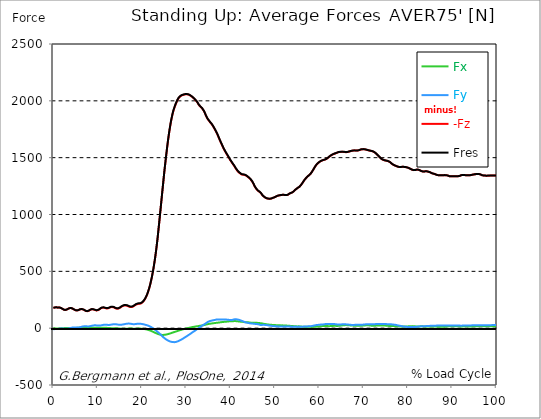
| Category |  Fx |  Fy |  -Fz |  Fres |
|---|---|---|---|---|
| 0.0 | -1.342 | -9.124 | 178.404 | 178.734 |
| 0.167348456675344 | -1.436 | -8.606 | 179.699 | 179.982 |
| 0.334696913350688 | -1.813 | -8.171 | 182.03 | 182.289 |
| 0.5020453700260321 | -2.155 | -7.617 | 183.82 | 184.043 |
| 0.669393826701376 | -2.355 | -6.723 | 183.914 | 184.102 |
| 0.83674228337672 | -2.096 | -6.687 | 181.901 | 182.089 |
| 1.0040907400520642 | -1.943 | -6.711 | 180.523 | 180.7 |
| 1.1621420602454444 | -2.296 | -5.969 | 181.889 | 182.054 |
| 1.3294905169207885 | -2.508 | -5.145 | 182.289 | 182.43 |
| 1.4968389735961325 | -2.484 | -4.286 | 181.041 | 181.171 |
| 1.6641874302714765 | -2.261 | -3.626 | 178.639 | 178.745 |
| 1.8315358869468206 | -1.848 | -3.273 | 175.566 | 175.661 |
| 1.9988843436221646 | -1.26 | -2.79 | 171.257 | 171.34 |
| 2.1662328002975086 | -0.506 | -3.002 | 166.854 | 166.937 |
| 2.333581256972853 | 0.224 | -3.626 | 163.216 | 163.31 |
| 2.5009297136481967 | 0.789 | -4.568 | 160.85 | 160.979 |
| 2.6682781703235405 | 1.107 | -5.133 | 160.284 | 160.438 |
| 2.8356266269988843 | 1.377 | -5.545 | 161.273 | 161.438 |
| 3.002975083674229 | 1.436 | -5.345 | 163.357 | 163.534 |
| 3.1703235403495724 | 1.377 | -4.768 | 166.736 | 166.901 |
| 3.337671997024917 | 0.977 | -3.473 | 170.798 | 170.928 |
| 3.4957233172182973 | 0.542 | -2.06 | 174.319 | 174.413 |
| 3.663071773893641 | 0.271 | -0.224 | 176.132 | 176.226 |
| 3.8304202305689854 | 0.071 | 1.648 | 177.274 | 177.368 |
| 3.997768687244329 | 0.047 | 3.273 | 176.673 | 176.803 |
| 4.165117143919673 | 0.141 | 4.486 | 174.99 | 175.143 |
| 4.332465600595017 | 0.318 | 5.734 | 172.364 | 172.564 |
| 4.499814057270361 | 0.612 | 6.452 | 168.832 | 169.079 |
| 4.667162513945706 | 1.118 | 6.84 | 164.358 | 164.664 |
| 4.834510970621049 | 1.625 | 6.982 | 160.485 | 160.826 |
| 5.001859427296393 | 2.096 | 6.523 | 157.718 | 158.059 |
| 5.169207883971737 | 2.531 | 5.946 | 155.834 | 156.176 |
| 5.336556340647081 | 2.802 | 5.486 | 155.999 | 156.352 |
| 5.503904797322425 | 2.908 | 5.263 | 157.023 | 157.388 |
| 5.671253253997769 | 2.955 | 5.522 | 159.131 | 159.519 |
| 5.82930457419115 | 2.767 | 6.628 | 162.286 | 162.722 |
| 5.996653030866494 | 2.543 | 8.43 | 165.477 | 166.054 |
| 6.164001487541838 | 2.319 | 10.243 | 167.09 | 167.784 |
| 6.331349944217181 | 2.143 | 11.927 | 167.843 | 168.62 |
| 6.498698400892526 | 2.178 | 13.528 | 166.748 | 167.643 |
| 6.66604685756787 | 2.308 | 15.023 | 165.088 | 166.112 |
| 6.833395314243213 | 2.567 | 15.977 | 162.427 | 163.558 |
| 7.000743770918558 | 2.99 | 16.789 | 158.813 | 160.014 |
| 7.168092227593902 | 3.497 | 16.707 | 154.704 | 155.917 |
| 7.335440684269246 | 3.991 | 16.53 | 150.807 | 152.043 |
| 7.50278914094459 | 4.25 | 16.13 | 149.559 | 150.771 |
| 7.6701375976199335 | 4.368 | 15.612 | 149.406 | 150.583 |
| 7.837486054295278 | 4.45 | 15.788 | 150.654 | 151.796 |
| 7.995537374488658 | 4.439 | 15.741 | 153.468 | 154.598 |
| 8.162885831164003 | 4.274 | 16.306 | 157.435 | 158.613 |
| 8.330234287839346 | 4.015 | 17.625 | 161.78 | 163.075 |
| 8.49758274451469 | 3.815 | 19.167 | 165.206 | 166.666 |
| 8.664931201190035 | 3.838 | 20.816 | 166.159 | 167.831 |
| 8.832279657865378 | 3.873 | 22.417 | 165.983 | 167.867 |
| 8.999628114540721 | 3.991 | 23.771 | 165.006 | 167.101 |
| 9.166976571216066 | 4.132 | 24.713 | 163.11 | 165.371 |
| 9.334325027891412 | 4.356 | 25.207 | 160.39 | 162.745 |
| 9.501673484566755 | 4.533 | 24.995 | 157.459 | 159.825 |
| 9.669021941242098 | 4.615 | 24.571 | 156.128 | 158.448 |
| 9.836370397917442 | 4.674 | 23.877 | 155.657 | 157.894 |
| 10.003718854592787 | 4.615 | 23.488 | 156.882 | 159.06 |
| 10.17106731126813 | 4.403 | 23.17 | 159.649 | 161.756 |
| 10.329118631461512 | 4.168 | 23.241 | 163.593 | 165.724 |
| 10.496467088136853 | 3.885 | 23.453 | 168.703 | 170.822 |
| 10.663815544812199 | 3.532 | 23.936 | 174.13 | 176.308 |
| 10.831164001487544 | 3.261 | 25.101 | 177.827 | 180.111 |
| 10.998512458162887 | 3.061 | 26.549 | 180.005 | 182.466 |
| 11.16586091483823 | 3.014 | 28.092 | 180.817 | 183.502 |
| 11.333209371513574 | 3.026 | 29.375 | 180.511 | 183.384 |
| 11.50055782818892 | 3.049 | 30.281 | 179.334 | 182.383 |
| 11.667906284864264 | 3.096 | 30.611 | 177.015 | 180.17 |
| 11.835254741539607 | 3.026 | 30.446 | 174.742 | 177.909 |
| 12.00260319821495 | 2.837 | 29.975 | 173.212 | 176.32 |
| 12.169951654890292 | 2.508 | 29.139 | 173.306 | 176.226 |
| 12.337300111565641 | 2.084 | 28.61 | 174.472 | 177.25 |
| 12.504648568240984 | 1.566 | 28.48 | 176.767 | 179.452 |
| 12.662699888434362 | 1.013 | 28.716 | 180.146 | 182.795 |
| 12.830048345109708 | 0.459 | 29.657 | 182.89 | 185.656 |
| 12.997396801785053 | -0.071 | 30.752 | 185.115 | 188.035 |
| 13.164745258460396 | -0.447 | 31.989 | 186.163 | 189.306 |
| 13.33209371513574 | -0.624 | 33.131 | 185.774 | 189.141 |
| 13.499442171811083 | -0.754 | 34.073 | 184.479 | 188.07 |
| 13.666790628486426 | -0.918 | 34.708 | 182.266 | 186.033 |
| 13.834139085161771 | -0.848 | 35.05 | 178.934 | 182.807 |
| 14.001487541837117 | -0.648 | 34.791 | 174.954 | 178.828 |
| 14.16883599851246 | -0.836 | 33.837 | 172.341 | 176.096 |
| 14.336184455187803 | -1.354 | 33.036 | 170.881 | 174.554 |
| 14.503532911863147 | -1.978 | 31.953 | 171.34 | 174.872 |
| 14.670881368538492 | -2.602 | 30.894 | 172.682 | 176.061 |
| 14.828932688731873 | -3.191 | 30.105 | 175.402 | 178.651 |
| 14.996281145407215 | -3.685 | 29.622 | 178.957 | 182.113 |
| 15.163629602082558 | -3.991 | 29.775 | 183.337 | 186.504 |
| 15.330978058757903 | -4.486 | 30.411 | 188.07 | 191.308 |
| 15.498326515433247 | -4.839 | 31.329 | 191.943 | 195.264 |
| 15.665674972108594 | -5.086 | 32.401 | 195.287 | 198.725 |
| 15.833023428783937 | -5.133 | 33.802 | 198.101 | 201.751 |
| 16.00037188545928 | -5.192 | 35.12 | 199.714 | 203.529 |
| 16.167720342134626 | -5.098 | 36.533 | 200.161 | 204.235 |
| 16.335068798809967 | -4.933 | 37.734 | 199.855 | 204.141 |
| 16.502417255485312 | -4.639 | 38.841 | 198.631 | 203.14 |
| 16.669765712160658 | -4.333 | 39.771 | 196.464 | 201.197 |
| 16.837114168836 | -4.015 | 40.207 | 193.568 | 198.442 |
| 17.004462625511344 | -3.65 | 40.36 | 190.272 | 195.205 |
| 17.16251394570472 | -3.332 | 40.112 | 187.093 | 192.026 |
| 17.32986240238007 | -3.238 | 39.618 | 185.586 | 190.519 |
| 17.497210859055414 | -3.32 | 38.44 | 184.832 | 189.601 |
| 17.664559315730756 | -3.579 | 37.192 | 185.609 | 190.166 |
| 17.8319077724061 | -3.921 | 35.968 | 187.352 | 191.637 |
| 17.999256229081443 | -4.238 | 34.967 | 190.578 | 194.675 |
| 18.166604685756788 | -4.486 | 34.697 | 194.404 | 198.36 |
| 18.333953142432133 | -4.474 | 35.438 | 199.584 | 203.576 |
| 18.501301599107478 | -4.333 | 36.498 | 204.447 | 208.532 |
| 18.668650055782823 | -4.132 | 37.463 | 207.59 | 211.817 |
| 18.835998512458165 | -4.097 | 37.805 | 210.581 | 214.902 |
| 19.00334696913351 | -4.027 | 38.299 | 212.783 | 217.221 |
| 19.170695425808855 | -3.779 | 39.006 | 213.96 | 218.516 |
| 19.338043882484197 | -3.614 | 38.947 | 214.596 | 219.117 |
| 19.496095202677576 | -3.461 | 38.805 | 215.196 | 219.658 |
| 19.66344365935292 | -3.873 | 38.723 | 216.114 | 220.53 |
| 19.830792116028263 | -4.403 | 38.028 | 219.07 | 223.308 |
| 19.998140572703612 | -4.992 | 36.71 | 223.496 | 227.476 |
| 20.165489029378953 | -5.722 | 35.273 | 229.289 | 232.951 |
| 20.3328374860543 | -6.428 | 33.931 | 236.836 | 240.168 |
| 20.500185942729644 | -7.382 | 32.471 | 246.031 | 249.139 |
| 20.667534399404985 | -8.489 | 30.882 | 255.921 | 258.817 |
| 20.83488285608033 | -9.642 | 29.057 | 267.706 | 270.379 |
| 21.002231312755672 | -11.02 | 27.079 | 281.493 | 283.918 |
| 21.16957976943102 | -12.645 | 24.995 | 297.399 | 299.612 |
| 21.336928226106362 | -14.47 | 22.805 | 315.459 | 317.52 |
| 21.504276682781704 | -16.33 | 20.415 | 335.521 | 337.452 |
| 21.67162513945705 | -18.331 | 17.672 | 357.279 | 359.151 |
| 21.82967645965043 | -20.827 | 14.423 | 382.05 | 383.852 |
| 21.997024916325774 | -23.523 | 10.902 | 409.377 | 411.072 |
| 22.16437337300112 | -26.29 | 7.194 | 438.728 | 440.376 |
| 22.33172182967646 | -29.234 | 3.144 | 471.317 | 472.989 |
| 22.499070286351806 | -32.259 | -1.083 | 506.096 | 507.815 |
| 22.666418743027148 | -35.285 | -5.675 | 544.348 | 546.149 |
| 22.833767199702496 | -38.323 | -10.573 | 585.532 | 587.474 |
| 23.00111565637784 | -41.278 | -15.706 | 630.377 | 632.496 |
| 23.168464113053183 | -44.151 | -20.922 | 678.542 | 680.826 |
| 23.335812569728528 | -47 | -26.243 | 730.711 | 733.195 |
| 23.50316102640387 | -49.802 | -31.753 | 785.893 | 788.566 |
| 23.670509483079215 | -52.345 | -37.404 | 848.116 | 850.989 |
| 23.83785793975456 | -54.476 | -42.761 | 910.374 | 913.424 |
| 23.995909259947936 | -56.454 | -48.742 | 974.705 | 977.978 |
| 24.163257716623285 | -57.89 | -54.806 | 1038.717 | 1042.202 |
| 24.330606173298627 | -58.667 | -61.352 | 1104.943 | 1108.617 |
| 24.49795462997397 | -59.232 | -67.957 | 1168.673 | 1172.547 |
| 24.665303086649313 | -59.35 | -74.585 | 1232.568 | 1236.63 |
| 24.83265154332466 | -59.232 | -80.295 | 1297.617 | 1301.808 |
| 25.0 | -58.856 | -86.123 | 1361.476 | 1365.809 |
| 25.167348456675345 | -58.043 | -91.292 | 1420.897 | 1425.347 |
| 25.334696913350694 | -56.984 | -96.095 | 1477.386 | 1481.919 |
| 25.502045370026035 | -55.406 | -100.593 | 1533.57 | 1538.173 |
| 25.669393826701377 | -53.887 | -104.69 | 1587.904 | 1592.555 |
| 25.836742283376722 | -52.333 | -108.481 | 1639.508 | 1644.205 |
| 26.004090740052067 | -50.638 | -111.778 | 1687.131 | 1691.864 |
| 26.17143919672741 | -48.672 | -114.603 | 1731.129 | 1735.874 |
| 26.329490516920792 | -46.505 | -117.087 | 1772.195 | 1776.951 |
| 26.49683897359613 | -44.304 | -119.16 | 1810.117 | 1814.874 |
| 26.66418743027148 | -42.079 | -120.514 | 1842.836 | 1847.557 |
| 26.831535886946828 | -39.842 | -121.679 | 1873.035 | 1877.733 |
| 26.998884343622166 | -37.616 | -122.762 | 1900.656 | 1905.318 |
| 27.166232800297514 | -35.497 | -123.233 | 1922.743 | 1927.346 |
| 27.333581256972852 | -33.425 | -122.88 | 1942.216 | 1946.737 |
| 27.5009297136482 | -31.365 | -122.409 | 1960.288 | 1964.727 |
| 27.668278170323543 | -29.304 | -121.055 | 1976.665 | 1980.951 |
| 27.835626626998888 | -27.373 | -119.289 | 1992.513 | 1996.633 |
| 28.002975083674233 | -25.03 | -116.734 | 2006.535 | 2010.467 |
| 28.170323540349575 | -22.794 | -114.026 | 2018.391 | 2022.146 |
| 28.33767199702492 | -20.662 | -111.26 | 2027.739 | 2031.342 |
| 28.50502045370026 | -18.579 | -108.316 | 2035.05 | 2038.5 |
| 28.663071773893645 | -16.471 | -104.655 | 2040.866 | 2044.175 |
| 28.830420230568986 | -14.505 | -101.193 | 2044.905 | 2048.036 |
| 28.99776868724433 | -12.633 | -97.461 | 2048.46 | 2051.462 |
| 29.165117143919673 | -10.914 | -93.847 | 2050.709 | 2053.582 |
| 29.33246560059502 | -9.089 | -89.867 | 2052.722 | 2055.477 |
| 29.499814057270367 | -7.37 | -85.605 | 2054.665 | 2057.361 |
| 29.66716251394571 | -5.757 | -81.261 | 2056.195 | 2058.868 |
| 29.834510970621054 | -4.109 | -77.234 | 2057.267 | 2059.892 |
| 30.00185942729639 | -2.272 | -73.031 | 2057.502 | 2060.01 |
| 30.169207883971744 | -0.624 | -68.84 | 2057.385 | 2059.81 |
| 30.33655634064708 | 0.824 | -64.625 | 2056.396 | 2058.786 |
| 30.50390479732243 | 2.049 | -60.751 | 2054.7 | 2057.067 |
| 30.671253253997772 | 3.509 | -56.148 | 2052.075 | 2054.335 |
| 30.829304574191156 | 4.745 | -51.851 | 2048.966 | 2051.145 |
| 30.996653030866494 | 6.428 | -47.365 | 2043.916 | 2046.011 |
| 31.164001487541842 | 7.818 | -42.432 | 2039.171 | 2041.184 |
| 31.331349944217187 | 9.23 | -37.887 | 2034.132 | 2036.157 |
| 31.498698400892525 | 10.549 | -33.272 | 2028.622 | 2030.67 |
| 31.666046857567874 | 11.703 | -29.069 | 2022.664 | 2024.76 |
| 31.833395314243212 | 12.692 | -25.419 | 2016.413 | 2018.567 |
| 32.00074377091856 | 13.94 | -21.039 | 2008.772 | 2010.856 |
| 32.1680922275939 | 15.141 | -15.753 | 2001.755 | 2003.815 |
| 32.33544068426925 | 16.365 | -10.949 | 1995.209 | 1997.304 |
| 32.50278914094459 | 17.307 | -7.205 | 1985.331 | 1987.415 |
| 32.670137597619934 | 18.131 | -2.661 | 1973.604 | 1975.665 |
| 32.83748605429528 | 19.426 | 2.39 | 1963.95 | 1965.987 |
| 33.004834510970625 | 20.768 | 7.453 | 1955.932 | 1957.969 |
| 33.162885831164004 | 21.899 | 12.009 | 1948.962 | 1951.117 |
| 33.33023428783935 | 22.852 | 16.365 | 1943.335 | 1945.654 |
| 33.497582744514695 | 23.865 | 20.651 | 1936.506 | 1938.931 |
| 33.664931201190036 | 24.948 | 24.748 | 1927.17 | 1929.677 |
| 33.83227965786538 | 26.008 | 28.751 | 1917.48 | 1920.094 |
| 33.99962811454073 | 27.091 | 32.589 | 1907.19 | 1909.91 |
| 34.16697657121607 | 28.798 | 36.71 | 1893.026 | 1895.675 |
| 34.33432502789141 | 30.599 | 41.101 | 1877.686 | 1880.217 |
| 34.50167348456676 | 32.46 | 45.622 | 1863.133 | 1865.535 |
| 34.6690219412421 | 34.19 | 50.379 | 1849.559 | 1851.866 |
| 34.83637039791744 | 35.591 | 54.782 | 1838.727 | 1841.035 |
| 35.00371885459279 | 36.521 | 57.502 | 1830.544 | 1832.982 |
| 35.17106731126814 | 37.581 | 59.597 | 1822.197 | 1824.775 |
| 35.338415767943474 | 39.123 | 62.67 | 1812.637 | 1815.274 |
| 35.49646708813686 | 40.324 | 64.378 | 1805.031 | 1807.739 |
| 35.6638155448122 | 41.207 | 65.743 | 1797.743 | 1800.487 |
| 35.831164001487544 | 41.984 | 67.568 | 1788.077 | 1790.868 |
| 35.998512458162885 | 42.773 | 69.405 | 1778.4 | 1781.249 |
| 36.165860914838234 | 43.656 | 70.37 | 1767.25 | 1770.193 |
| 36.333209371513576 | 44.586 | 71.512 | 1755.665 | 1758.679 |
| 36.50055782818892 | 45.528 | 73.29 | 1743.55 | 1746.623 |
| 36.667906284864266 | 46.458 | 74.597 | 1731.176 | 1734.308 |
| 36.83525474153961 | 47.388 | 75.939 | 1718.402 | 1721.604 |
| 37.002603198214956 | 48.154 | 77.116 | 1704.956 | 1708.241 |
| 37.1699516548903 | 48.719 | 77.211 | 1689.733 | 1693.077 |
| 37.337300111565646 | 49.366 | 77.234 | 1673.921 | 1677.312 |
| 37.50464856824098 | 50.238 | 77.105 | 1658.51 | 1661.96 |
| 37.66269988843437 | 51.356 | 76.822 | 1643.511 | 1647.007 |
| 37.83004834510971 | 52.404 | 76.528 | 1628.817 | 1632.385 |
| 37.99739680178505 | 53.275 | 76.151 | 1614.913 | 1618.539 |
| 38.16474525846039 | 54.335 | 75.739 | 1600.078 | 1603.775 |
| 38.33209371513574 | 54.9 | 75.374 | 1586.209 | 1589.906 |
| 38.49944217181109 | 55.477 | 75.433 | 1572.928 | 1576.649 |
| 38.666790628486424 | 56.065 | 75.692 | 1560.778 | 1564.499 |
| 38.83413908516178 | 56.583 | 75.916 | 1549.37 | 1553.125 |
| 39.001487541837115 | 57.172 | 75.645 | 1538.42 | 1542.2 |
| 39.16883599851246 | 57.867 | 74.75 | 1527.565 | 1531.356 |
| 39.336184455187805 | 58.314 | 73.561 | 1516.804 | 1520.607 |
| 39.503532911863154 | 59.268 | 72.984 | 1505.725 | 1509.587 |
| 39.670881368538495 | 60.021 | 72.843 | 1494.423 | 1498.331 |
| 39.83822982521384 | 60.375 | 72.843 | 1483.238 | 1487.147 |
| 39.996281145407224 | 60.586 | 72.819 | 1472.771 | 1476.668 |
| 40.163629602082565 | 60.598 | 72.513 | 1463.034 | 1466.908 |
| 40.33097805875791 | 60.551 | 72.113 | 1453.557 | 1457.407 |
| 40.498326515433256 | 60.857 | 73.125 | 1443.761 | 1447.623 |
| 40.6656749721086 | 61.964 | 76.139 | 1434.319 | 1438.263 |
| 40.83302342878393 | 62.341 | 77.894 | 1425.336 | 1429.35 |
| 41.00037188545929 | 62.364 | 78.294 | 1413.951 | 1418.024 |
| 41.16772034213463 | 61.987 | 77.894 | 1403.543 | 1407.652 |
| 41.33506879880997 | 61.328 | 77.328 | 1394.313 | 1398.41 |
| 41.50241725548531 | 60.74 | 76.81 | 1385.047 | 1389.132 |
| 41.66976571216066 | 59.597 | 75.315 | 1377.406 | 1381.432 |
| 41.837114168836 | 58.997 | 73.832 | 1370.106 | 1374.062 |
| 42.004462625511344 | 58.397 | 71.889 | 1364.867 | 1368.764 |
| 42.17181108218669 | 57.561 | 69.487 | 1360.287 | 1364.102 |
| 42.32986240238007 | 56.689 | 66.826 | 1356.567 | 1360.287 |
| 42.497210859055414 | 56.301 | 65.107 | 1351.857 | 1355.495 |
| 42.66455931573076 | 55.547 | 62.341 | 1350.739 | 1354.212 |
| 42.831907772406105 | 54.759 | 59.362 | 1349.915 | 1353.235 |
| 42.999256229081446 | 53.97 | 56.43 | 1349.055 | 1352.21 |
| 43.16660468575679 | 52.981 | 53.993 | 1347.748 | 1350.786 |
| 43.33395314243214 | 52.004 | 51.556 | 1346.441 | 1349.361 |
| 43.50130159910748 | 51.662 | 50.014 | 1342.097 | 1344.958 |
| 43.66865005578282 | 51.427 | 48.613 | 1337.282 | 1340.107 |
| 43.83599851245817 | 51.309 | 47.035 | 1332.019 | 1334.797 |
| 44.00334696913351 | 51.203 | 45.434 | 1326.686 | 1329.417 |
| 44.17069542580886 | 50.308 | 44.056 | 1321.399 | 1324.072 |
| 44.3380438824842 | 49.296 | 42.938 | 1315.607 | 1318.232 |
| 44.49609520267758 | 48.424 | 41.996 | 1308.649 | 1311.25 |
| 44.66344365935292 | 47.624 | 41.16 | 1300.854 | 1303.433 |
| 44.83079211602827 | 46.988 | 40.513 | 1291.447 | 1294.002 |
| 44.99814057270361 | 46.705 | 40.018 | 1280.357 | 1282.947 |
| 45.16548902937895 | 47.094 | 39.477 | 1268.218 | 1270.856 |
| 45.332837486054295 | 47.706 | 38.499 | 1253.866 | 1256.515 |
| 45.500185942729644 | 48.142 | 37.569 | 1241.975 | 1244.624 |
| 45.66753439940499 | 48.012 | 36.698 | 1231.732 | 1234.346 |
| 45.83488285608033 | 47.341 | 35.78 | 1222.69 | 1225.221 |
| 46.00223131275568 | 46.623 | 35.591 | 1215.084 | 1217.569 |
| 46.16957976943102 | 45.858 | 35.05 | 1208.456 | 1210.858 |
| 46.336928226106366 | 45.434 | 33.449 | 1204.006 | 1206.266 |
| 46.50427668278171 | 44.775 | 30.882 | 1199.567 | 1201.616 |
| 46.671625139457056 | 44.162 | 28.763 | 1194.057 | 1195.953 |
| 46.829676459650436 | 43.279 | 27.574 | 1187.417 | 1189.183 |
| 46.99702491632577 | 41.973 | 28.139 | 1178.551 | 1180.223 |
| 47.16437337300112 | 40.713 | 29.634 | 1168.838 | 1170.428 |
| 47.33172182967646 | 39.5 | 29.516 | 1162.127 | 1163.646 |
| 47.49907028635181 | 38.311 | 29.21 | 1156.653 | 1158.112 |
| 47.66641874302716 | 37.134 | 28.81 | 1152.155 | 1153.568 |
| 47.83376719970249 | 36.039 | 28.08 | 1147.893 | 1149.247 |
| 48.001115656377834 | 34.92 | 27.291 | 1144.055 | 1145.35 |
| 48.16846411305319 | 33.696 | 26.267 | 1141.653 | 1142.878 |
| 48.33581256972853 | 32.648 | 26.043 | 1139.864 | 1141.041 |
| 48.50316102640387 | 31.894 | 24.724 | 1138.71 | 1139.816 |
| 48.67050948307921 | 31.223 | 23.441 | 1138.003 | 1139.063 |
| 48.837857939754564 | 30.705 | 22.217 | 1137.992 | 1139.016 |
| 49.005206396429905 | 30.152 | 21.098 | 1138.404 | 1139.404 |
| 49.163257716623285 | 29.493 | 20.333 | 1140.087 | 1141.053 |
| 49.33060617329863 | 28.774 | 19.591 | 1142.513 | 1143.443 |
| 49.49795462997397 | 28.209 | 18.743 | 1145.574 | 1146.457 |
| 49.66530308664932 | 27.88 | 17.802 | 1148.34 | 1149.212 |
| 49.832651543324666 | 27.103 | 17.13 | 1150.236 | 1151.072 |
| 50.0 | 26.973 | 16.907 | 1153.603 | 1154.427 |
| 50.16734845667534 | 26.479 | 16.389 | 1156.806 | 1157.618 |
| 50.33469691335069 | 26.455 | 16.224 | 1160.349 | 1161.185 |
| 50.50204537002604 | 26.49 | 16 | 1163.375 | 1164.199 |
| 50.66939382670139 | 26.278 | 15.459 | 1165.094 | 1165.918 |
| 50.836742283376715 | 25.808 | 14.882 | 1166.931 | 1167.755 |
| 51.00409074005207 | 25.395 | 14.54 | 1169.674 | 1170.498 |
| 51.17143919672741 | 25.019 | 14.222 | 1169.556 | 1170.38 |
| 51.32949051692079 | 24.418 | 14.364 | 1169.333 | 1170.145 |
| 51.496838973596134 | 24.383 | 14.246 | 1171.428 | 1172.229 |
| 51.66418743027148 | 24.736 | 14.234 | 1172.959 | 1173.759 |
| 51.831535886946824 | 24.206 | 14.317 | 1173.854 | 1174.642 |
| 51.99888434362217 | 23.877 | 14.576 | 1172.735 | 1173.5 |
| 52.16623280029752 | 23.5 | 14.858 | 1171.57 | 1172.288 |
| 52.33358125697285 | 23.111 | 15.247 | 1170.934 | 1171.628 |
| 52.5009297136482 | 22.723 | 15.694 | 1170.604 | 1171.24 |
| 52.668278170323546 | 22.405 | 15.258 | 1170.557 | 1171.146 |
| 52.835626626998895 | 21.852 | 14.305 | 1172.453 | 1173.006 |
| 53.00297508367424 | 21.051 | 13.787 | 1176.432 | 1176.962 |
| 53.17032354034958 | 20.38 | 13.822 | 1181.212 | 1181.707 |
| 53.33767199702492 | 20.298 | 14.411 | 1185.639 | 1186.11 |
| 53.50502045370027 | 20.121 | 13.881 | 1188.5 | 1188.947 |
| 53.663071773893655 | 19.744 | 13.21 | 1190.36 | 1190.784 |
| 53.83042023056899 | 19.297 | 12.774 | 1192.738 | 1193.15 |
| 53.99776868724433 | 18.59 | 12.645 | 1196.635 | 1197.036 |
| 54.16511714391967 | 17.743 | 12.562 | 1201.839 | 1202.24 |
| 54.33246560059503 | 16.977 | 12.88 | 1208.303 | 1208.691 |
| 54.49981405727037 | 16.389 | 13.163 | 1215.567 | 1215.944 |
| 54.667162513945705 | 16.212 | 12.916 | 1220.7 | 1221.089 |
| 54.834510970621054 | 15.847 | 12.339 | 1225.21 | 1225.598 |
| 55.0018594272964 | 15.47 | 12.08 | 1230.614 | 1231.002 |
| 55.169207883971744 | 15.459 | 12.033 | 1235.288 | 1235.676 |
| 55.336556340647086 | 16.024 | 12.197 | 1238.361 | 1238.761 |
| 55.50390479732243 | 15.941 | 12.221 | 1243.482 | 1243.871 |
| 55.671253253997776 | 15.612 | 12.515 | 1250.146 | 1250.546 |
| 55.83860171067312 | 14.646 | 12.586 | 1257.987 | 1258.364 |
| 55.9966530308665 | 13.598 | 12.551 | 1265.663 | 1266.04 |
| 56.16400148754184 | 12.951 | 12.81 | 1275.589 | 1275.965 |
| 56.33134994421718 | 12.951 | 13.339 | 1285.62 | 1286.008 |
| 56.498698400892536 | 13.045 | 14.093 | 1295.45 | 1295.851 |
| 56.66604685756788 | 12.927 | 14.764 | 1304.893 | 1305.305 |
| 56.83339531424321 | 12.551 | 14.905 | 1313.028 | 1313.452 |
| 57.00074377091856 | 12.433 | 15.058 | 1320.316 | 1320.752 |
| 57.16809222759391 | 12.08 | 15.117 | 1327.215 | 1327.639 |
| 57.33544068426925 | 11.774 | 15.459 | 1333.867 | 1334.291 |
| 57.5027891409446 | 11.503 | 15.965 | 1340.366 | 1340.79 |
| 57.670137597619934 | 11.95 | 16.53 | 1345.146 | 1345.582 |
| 57.83748605429528 | 11.891 | 16.919 | 1350.197 | 1350.633 |
| 58.004834510970625 | 11.432 | 17.189 | 1356.837 | 1357.297 |
| 58.16288583116401 | 11.232 | 17.672 | 1364.796 | 1365.279 |
| 58.330234287839346 | 11.02 | 18.743 | 1375.192 | 1375.699 |
| 58.497582744514695 | 11.656 | 20.321 | 1385.577 | 1386.153 |
| 58.66493120119004 | 12.492 | 22.028 | 1395.961 | 1396.62 |
| 58.832279657865385 | 12.739 | 23.3 | 1407.099 | 1407.805 |
| 58.999628114540734 | 12.727 | 24.395 | 1418.519 | 1419.261 |
| 59.16697657121607 | 13.198 | 25.89 | 1427.761 | 1428.562 |
| 59.33432502789142 | 13.469 | 27.126 | 1437.145 | 1438.004 |
| 59.50167348456676 | 13.81 | 27.903 | 1444.103 | 1444.986 |
| 59.66902194124211 | 14.269 | 28.551 | 1450.555 | 1451.496 |
| 59.83637039791745 | 14.846 | 29.363 | 1456.335 | 1457.313 |
| 60.00371885459278 | 15.423 | 30.175 | 1461.622 | 1462.634 |
| 60.17106731126813 | 16.071 | 30.905 | 1466.249 | 1467.296 |
| 60.33841576794349 | 16.777 | 31.6 | 1469.757 | 1470.84 |
| 60.49646708813685 | 17.378 | 32.342 | 1473.018 | 1474.149 |
| 60.6638155448122 | 17.931 | 32.766 | 1475.597 | 1476.751 |
| 60.831164001487544 | 18.084 | 32.825 | 1477.834 | 1478.999 |
| 60.99851245816289 | 18.543 | 33.39 | 1480.012 | 1481.189 |
| 61.16586091483824 | 19.273 | 34.673 | 1481.86 | 1483.085 |
| 61.333209371513576 | 19.815 | 35.874 | 1483.815 | 1485.074 |
| 61.50055782818892 | 19.52 | 36.557 | 1486.617 | 1487.888 |
| 61.667906284864266 | 18.849 | 37.039 | 1490.655 | 1491.927 |
| 61.835254741539615 | 18.39 | 37.11 | 1495.011 | 1496.283 |
| 62.002603198214956 | 17.896 | 37.098 | 1500.521 | 1501.805 |
| 62.16995165489029 | 17.79 | 36.945 | 1506.267 | 1507.562 |
| 62.33730011156564 | 17.849 | 36.91 | 1511.235 | 1512.542 |
| 62.504648568240995 | 17.919 | 37.016 | 1515.603 | 1516.934 |
| 62.67199702491633 | 18.414 | 36.486 | 1520.583 | 1521.949 |
| 62.83004834510971 | 18.991 | 36.321 | 1524.516 | 1525.893 |
| 62.99739680178505 | 19.532 | 36.274 | 1527.871 | 1529.272 |
| 63.1647452584604 | 20.062 | 36.168 | 1531.097 | 1532.498 |
| 63.33209371513575 | 20.615 | 36.333 | 1533.723 | 1535.135 |
| 63.4994421718111 | 20.78 | 35.874 | 1535.642 | 1537.031 |
| 63.666790628486424 | 20.309 | 34.908 | 1537.973 | 1539.291 |
| 63.83413908516177 | 19.838 | 33.79 | 1540.728 | 1541.976 |
| 64.00148754183712 | 19.509 | 32.719 | 1543.671 | 1544.849 |
| 64.16883599851248 | 19.579 | 32.095 | 1546.485 | 1547.627 |
| 64.3361844551878 | 20.239 | 32.271 | 1548.498 | 1549.652 |
| 64.50353291186315 | 20.886 | 32.507 | 1549.652 | 1550.818 |
| 64.6708813685385 | 21.64 | 32.73 | 1550.3 | 1551.489 |
| 64.83822982521384 | 22.452 | 32.954 | 1550.829 | 1552.042 |
| 65.00557828188919 | 23.347 | 33.319 | 1551.053 | 1552.301 |
| 65.16362960208257 | 24.253 | 33.696 | 1551.218 | 1552.501 |
| 65.3309780587579 | 25.301 | 33.919 | 1551.077 | 1552.384 |
| 65.49832651543326 | 25.972 | 34.002 | 1550.629 | 1551.96 |
| 65.6656749721086 | 26.373 | 33.967 | 1549.817 | 1551.159 |
| 65.83302342878395 | 26.702 | 33.743 | 1549.005 | 1550.347 |
| 66.00037188545929 | 27.032 | 33.531 | 1548.204 | 1549.546 |
| 66.16772034213463 | 26.738 | 33.107 | 1548.322 | 1549.652 |
| 66.33506879880998 | 26.49 | 32.53 | 1549.334 | 1550.653 |
| 66.50241725548531 | 26.09 | 31.8 | 1550.853 | 1552.125 |
| 66.66976571216065 | 25.619 | 31.082 | 1552.76 | 1554.008 |
| 66.83711416883601 | 24.783 | 30.081 | 1554.703 | 1555.904 |
| 67.00446262551135 | 24.136 | 29.328 | 1556.681 | 1557.835 |
| 67.1718110821867 | 23.735 | 28.927 | 1558.682 | 1559.836 |
| 67.32986240238007 | 23.241 | 28.657 | 1560.025 | 1561.155 |
| 67.49721085905541 | 22.664 | 28.621 | 1561.343 | 1562.473 |
| 67.66455931573076 | 22.122 | 28.621 | 1562.568 | 1563.698 |
| 67.83190777240611 | 21.84 | 28.786 | 1563.109 | 1564.251 |
| 67.99925622908145 | 21.781 | 28.963 | 1563.133 | 1564.275 |
| 68.16660468575678 | 21.863 | 29.163 | 1562.768 | 1563.933 |
| 68.33395314243214 | 21.946 | 29.375 | 1562.403 | 1563.568 |
| 68.50130159910749 | 22.028 | 29.587 | 1562.026 | 1563.215 |
| 68.66865005578282 | 22.04 | 29.787 | 1562.638 | 1563.827 |
| 68.83599851245816 | 21.899 | 29.775 | 1563.827 | 1564.993 |
| 69.00334696913352 | 21.534 | 29.634 | 1565.593 | 1566.747 |
| 69.17069542580886 | 21.157 | 29.657 | 1568.207 | 1569.349 |
| 69.3380438824842 | 20.91 | 29.716 | 1571.351 | 1572.505 |
| 69.50539233915956 | 21.416 | 29.987 | 1572.622 | 1573.8 |
| 69.66344365935292 | 22.052 | 30.399 | 1573.34 | 1574.53 |
| 69.83079211602826 | 22.582 | 30.976 | 1574.059 | 1575.26 |
| 69.99814057270362 | 23.111 | 31.718 | 1574.059 | 1575.271 |
| 70.16548902937896 | 23.641 | 32.566 | 1573.564 | 1574.812 |
| 70.33283748605429 | 24.277 | 33.26 | 1572.528 | 1573.8 |
| 70.50018594272964 | 25.066 | 33.743 | 1570.797 | 1572.092 |
| 70.667534399405 | 25.325 | 34.108 | 1568.925 | 1570.232 |
| 70.83488285608033 | 25.254 | 34.402 | 1566.983 | 1568.266 |
| 71.00223131275568 | 25.195 | 34.685 | 1565.04 | 1566.312 |
| 71.16957976943102 | 24.524 | 34.649 | 1563.545 | 1564.769 |
| 71.33692822610637 | 23.841 | 34.602 | 1562.061 | 1563.251 |
| 71.50427668278171 | 23.1 | 34.52 | 1560.625 | 1561.767 |
| 71.67162513945706 | 22.323 | 34.402 | 1559.236 | 1560.342 |
| 71.8389735961324 | 21.534 | 34.284 | 1557.847 | 1558.906 |
| 71.99702491632577 | 20.933 | 34.32 | 1556.175 | 1557.211 |
| 72.16437337300113 | 20.58 | 34.579 | 1554.103 | 1555.127 |
| 72.33172182967647 | 20.721 | 34.779 | 1550.535 | 1551.559 |
| 72.49907028635181 | 21.11 | 35.191 | 1545.967 | 1546.98 |
| 72.66641874302715 | 21.91 | 35.591 | 1540.975 | 1542.011 |
| 72.8337671997025 | 22.582 | 35.827 | 1535.171 | 1536.23 |
| 73.00111565637783 | 23.182 | 36.18 | 1528.166 | 1529.26 |
| 73.16846411305319 | 23.559 | 36.38 | 1521.502 | 1522.608 |
| 73.33581256972853 | 23.476 | 36.274 | 1515.533 | 1516.639 |
| 73.50316102640387 | 23.217 | 36.769 | 1509.351 | 1510.47 |
| 73.67050948307921 | 22.994 | 37.028 | 1502.099 | 1503.217 |
| 73.83785793975457 | 22.805 | 37.039 | 1494.517 | 1495.624 |
| 74.00520639642991 | 22.593 | 37.004 | 1489.384 | 1490.479 |
| 74.16325771662328 | 22.841 | 37.145 | 1485.133 | 1486.228 |
| 74.33060617329863 | 23.17 | 37.334 | 1481.99 | 1483.085 |
| 74.49795462997398 | 23.135 | 37.357 | 1479.482 | 1480.542 |
| 74.66530308664932 | 23.1 | 37.381 | 1476.963 | 1478.01 |
| 74.83265154332466 | 22.935 | 37.181 | 1475.149 | 1476.174 |
| 75.00000000000001 | 22.111 | 36.298 | 1474.125 | 1475.091 |
| 75.16734845667534 | 20.922 | 35.556 | 1472.63 | 1473.56 |
| 75.3346969133507 | 20.262 | 34.897 | 1471.606 | 1472.489 |
| 75.50204537002605 | 20.062 | 34.802 | 1469.545 | 1470.416 |
| 75.66939382670138 | 20.074 | 34.826 | 1466.873 | 1467.732 |
| 75.83674228337672 | 19.85 | 34.626 | 1463.47 | 1464.306 |
| 76.00409074005208 | 19.827 | 34.72 | 1459.067 | 1459.891 |
| 76.17143919672742 | 19.838 | 34.638 | 1453.804 | 1454.605 |
| 76.33878765340276 | 19.097 | 33.19 | 1447.317 | 1448.059 |
| 76.49683897359614 | 19.014 | 32.412 | 1442.454 | 1443.149 |
| 76.66418743027148 | 18.908 | 31.824 | 1438.381 | 1439.052 |
| 76.83153588694682 | 18.402 | 30.835 | 1434.672 | 1435.308 |
| 76.99888434362218 | 17.543 | 30.175 | 1431.587 | 1432.188 |
| 77.16623280029752 | 17.566 | 29.61 | 1429.386 | 1429.986 |
| 77.33358125697285 | 17.613 | 28.162 | 1426.548 | 1427.114 |
| 77.5009297136482 | 17.319 | 26.09 | 1423.216 | 1423.723 |
| 77.66827817032356 | 16.754 | 24.783 | 1420.944 | 1421.415 |
| 77.83562662699889 | 16.165 | 23.335 | 1419.272 | 1419.708 |
| 78.00297508367423 | 15.364 | 22.287 | 1417.954 | 1418.342 |
| 78.17032354034959 | 14.693 | 20.992 | 1416.894 | 1417.259 |
| 78.33767199702493 | 14.01 | 19.579 | 1417.2 | 1417.542 |
| 78.50502045370027 | 13.716 | 18.237 | 1418.448 | 1418.778 |
| 78.67236891037561 | 13.622 | 16.942 | 1419.437 | 1419.779 |
| 78.83042023056899 | 13.916 | 15.776 | 1419.567 | 1419.908 |
| 78.99776868724433 | 14.387 | 15.141 | 1419.084 | 1419.449 |
| 79.16511714391969 | 14.634 | 13.846 | 1418.601 | 1418.978 |
| 79.33246560059503 | 14.74 | 12.81 | 1417.848 | 1418.236 |
| 79.49981405727036 | 14.67 | 12.103 | 1416.765 | 1417.141 |
| 79.66716251394571 | 14.87 | 11.62 | 1415.422 | 1415.799 |
| 79.83451097062107 | 15.364 | 11.397 | 1413.786 | 1414.163 |
| 80.00185942729641 | 15.647 | 10.961 | 1411.596 | 1411.973 |
| 80.16920788397174 | 15.776 | 10.408 | 1409.112 | 1409.477 |
| 80.33655634064709 | 16.424 | 10.219 | 1406.204 | 1406.581 |
| 80.50390479732243 | 17.272 | 10.455 | 1402.46 | 1402.837 |
| 80.67125325399778 | 17.554 | 10.29 | 1398.869 | 1399.246 |
| 80.83860171067312 | 17.825 | 10.137 | 1395.313 | 1395.69 |
| 80.99665303086651 | 17.966 | 10.29 | 1393.029 | 1393.394 |
| 81.16400148754184 | 17.625 | 10.29 | 1391.334 | 1391.687 |
| 81.3313499442172 | 16.813 | 10.125 | 1390.357 | 1390.686 |
| 81.49869840089255 | 16.094 | 10.078 | 1389.815 | 1390.109 |
| 81.66604685756786 | 15.906 | 11.102 | 1391.357 | 1391.628 |
| 81.83339531424322 | 15.282 | 12.174 | 1393.689 | 1393.948 |
| 82.00074377091858 | 14.646 | 12.904 | 1394.948 | 1395.207 |
| 82.16809222759392 | 14.069 | 13.504 | 1395.655 | 1395.902 |
| 82.33544068426926 | 14.481 | 13.963 | 1394.301 | 1394.56 |
| 82.50278914094459 | 15.176 | 14.517 | 1391.934 | 1392.193 |
| 82.67013759761994 | 15.753 | 15.105 | 1389.073 | 1389.344 |
| 82.83748605429528 | 16.506 | 15.93 | 1385.6 | 1385.871 |
| 83.00483451097062 | 16.989 | 16.577 | 1382.41 | 1382.692 |
| 83.17218296764597 | 16.671 | 16.765 | 1380.09 | 1380.373 |
| 83.33023428783935 | 15.812 | 16.636 | 1378.442 | 1378.713 |
| 83.4975827445147 | 15.317 | 16.765 | 1377.747 | 1378.006 |
| 83.66493120119004 | 15.035 | 16.942 | 1378.1 | 1378.359 |
| 83.83227965786537 | 14.752 | 17.378 | 1379.584 | 1379.843 |
| 83.99962811454073 | 14.611 | 17.872 | 1380.773 | 1381.032 |
| 84.16697657121607 | 14.823 | 18.331 | 1380.326 | 1380.596 |
| 84.33432502789142 | 15.223 | 18.896 | 1378.948 | 1379.242 |
| 84.50167348456677 | 14.705 | 19.085 | 1377.335 | 1377.629 |
| 84.6690219412421 | 14.14 | 19.261 | 1375.722 | 1376.005 |
| 84.83637039791745 | 14.375 | 19.956 | 1374.015 | 1374.309 |
| 85.0037188545928 | 14.74 | 20.333 | 1371.319 | 1371.625 |
| 85.17106731126813 | 14.552 | 20.462 | 1367.387 | 1367.704 |
| 85.33841576794349 | 14.375 | 20.533 | 1363.996 | 1364.314 |
| 85.50576422461883 | 14.034 | 20.368 | 1361.676 | 1361.982 |
| 85.66381554481221 | 13.504 | 20.298 | 1359.816 | 1360.122 |
| 85.83116400148755 | 13.222 | 20.651 | 1358.733 | 1359.027 |
| 85.99851245816289 | 13.563 | 21.345 | 1356.59 | 1356.908 |
| 86.16586091483823 | 14.01 | 22.005 | 1354.012 | 1354.353 |
| 86.33320937151358 | 13.94 | 22.24 | 1350.845 | 1351.198 |
| 86.50055782818893 | 13.681 | 22.44 | 1348.302 | 1348.655 |
| 86.66790628486427 | 13.386 | 22.64 | 1346.759 | 1347.101 |
| 86.83525474153961 | 13.316 | 22.746 | 1345.264 | 1345.617 |
| 87.00260319821496 | 12.951 | 22.817 | 1344.534 | 1344.887 |
| 87.16995165489031 | 12.857 | 22.899 | 1344.876 | 1345.217 |
| 87.33730011156564 | 13.139 | 22.911 | 1344.77 | 1345.111 |
| 87.504648568241 | 13.304 | 22.829 | 1344.428 | 1344.781 |
| 87.67199702491634 | 13.233 | 22.876 | 1344.511 | 1344.864 |
| 87.83004834510972 | 13.057 | 22.982 | 1344.864 | 1345.217 |
| 87.99739680178506 | 12.998 | 23.382 | 1345.641 | 1345.994 |
| 88.1647452584604 | 13.351 | 23.582 | 1346.029 | 1346.394 |
| 88.33209371513574 | 13.54 | 23.641 | 1346.241 | 1346.606 |
| 88.49944217181108 | 13.669 | 23.559 | 1345.994 | 1346.359 |
| 88.66679062848644 | 13.916 | 23.688 | 1345.417 | 1345.782 |
| 88.83413908516178 | 14.105 | 23.747 | 1344.087 | 1344.464 |
| 89.00148754183712 | 15.047 | 23.853 | 1342.438 | 1342.803 |
| 89.16883599851246 | 16 | 23.877 | 1339.848 | 1340.213 |
| 89.33618445518782 | 16.577 | 23.7 | 1336.987 | 1337.364 |
| 89.50353291186315 | 16.624 | 23.488 | 1335.916 | 1336.293 |
| 89.6708813685385 | 16.636 | 23.312 | 1335.633 | 1336.01 |
| 89.83822982521386 | 16.648 | 23.158 | 1335.904 | 1336.293 |
| 90.00557828188919 | 16.683 | 23.017 | 1336.234 | 1336.611 |
| 90.16362960208257 | 16.283 | 22.582 | 1336.21 | 1336.575 |
| 90.3309780587579 | 16 | 22.44 | 1336.022 | 1336.387 |
| 90.49832651543326 | 15.824 | 22.429 | 1335.775 | 1336.14 |
| 90.66567497210859 | 15.776 | 22.417 | 1335.916 | 1336.293 |
| 90.83302342878395 | 15.906 | 22.452 | 1336.175 | 1336.552 |
| 91.00037188545929 | 16.153 | 22.57 | 1335.975 | 1336.352 |
| 91.16772034213463 | 16.471 | 22.852 | 1336.434 | 1336.834 |
| 91.33506879880998 | 16.636 | 22.947 | 1336.94 | 1337.341 |
| 91.50241725548533 | 16.212 | 22.723 | 1337.823 | 1338.224 |
| 91.66976571216065 | 15.553 | 22.464 | 1339.483 | 1339.872 |
| 91.83711416883601 | 14.882 | 22.228 | 1342.215 | 1342.603 |
| 92.00446262551137 | 14.434 | 22.075 | 1345.276 | 1345.676 |
| 92.1718110821867 | 14.505 | 22.24 | 1347.23 | 1347.631 |
| 92.33915953886203 | 15.117 | 22.546 | 1347.996 | 1348.408 |
| 92.49721085905541 | 15.941 | 22.794 | 1347.819 | 1348.255 |
| 92.66455931573077 | 16.365 | 22.864 | 1347.124 | 1347.572 |
| 92.83190777240611 | 16.13 | 22.97 | 1346.383 | 1346.818 |
| 92.99925622908145 | 15.918 | 23.088 | 1345.606 | 1346.041 |
| 93.1666046857568 | 15.824 | 23.229 | 1344.734 | 1345.17 |
| 93.33395314243214 | 15.741 | 23.441 | 1344.31 | 1344.758 |
| 93.50130159910749 | 15.694 | 23.735 | 1344.393 | 1344.852 |
| 93.66865005578283 | 15.647 | 24.03 | 1344.487 | 1344.946 |
| 93.83599851245818 | 15.612 | 24.124 | 1344.982 | 1345.441 |
| 94.00334696913353 | 15.576 | 24.206 | 1345.488 | 1345.947 |
| 94.17069542580886 | 15.494 | 24.312 | 1346.489 | 1346.948 |
| 94.3380438824842 | 15.423 | 24.501 | 1347.901 | 1348.372 |
| 94.50539233915954 | 15.423 | 24.771 | 1349.42 | 1349.891 |
| 94.66344365935292 | 15.988 | 25.042 | 1350.927 | 1351.422 |
| 94.83079211602828 | 16.236 | 25.125 | 1351.963 | 1352.458 |
| 94.99814057270362 | 16.071 | 24.854 | 1353.023 | 1353.506 |
| 95.16548902937897 | 15.694 | 24.76 | 1354.671 | 1355.142 |
| 95.33283748605432 | 15.718 | 25.184 | 1355.33 | 1355.813 |
| 95.50018594272963 | 15.765 | 25.384 | 1356.037 | 1356.531 |
| 95.66753439940499 | 16.259 | 25.36 | 1356.461 | 1356.955 |
| 95.83488285608034 | 16.695 | 25.443 | 1356.414 | 1356.92 |
| 96.00223131275567 | 17.201 | 25.76 | 1355.825 | 1356.343 |
| 96.16957976943102 | 17.766 | 25.89 | 1354.483 | 1355.024 |
| 96.33692822610638 | 18.32 | 25.913 | 1352.693 | 1353.235 |
| 96.50427668278171 | 18.237 | 25.666 | 1349.809 | 1350.35 |
| 96.67162513945706 | 18.037 | 25.301 | 1345.923 | 1346.465 |
| 96.8389735961324 | 17.495 | 25.289 | 1344.664 | 1345.193 |
| 96.99702491632577 | 17.448 | 25.513 | 1343.427 | 1343.969 |
| 97.16437337300111 | 17.378 | 25.702 | 1342.803 | 1343.345 |
| 97.33172182967647 | 17.919 | 26.078 | 1342.403 | 1342.968 |
| 97.49907028635181 | 17.825 | 26.019 | 1341.673 | 1342.238 |
| 97.66641874302715 | 17.13 | 25.866 | 1341.026 | 1341.579 |
| 97.8337671997025 | 17.024 | 25.843 | 1341.45 | 1342.003 |
| 98.00111565637785 | 16.813 | 25.737 | 1341.732 | 1342.274 |
| 98.16846411305319 | 16.554 | 25.913 | 1341.767 | 1342.321 |
| 98.33581256972855 | 16.318 | 26.114 | 1341.897 | 1342.45 |
| 98.50316102640389 | 16.177 | 26.172 | 1341.838 | 1342.403 |
| 98.67050948307921 | 16.365 | 26.42 | 1342.25 | 1342.815 |
| 98.83785793975456 | 16.801 | 26.914 | 1342.827 | 1343.404 |
| 99.0052063964299 | 16.907 | 27.056 | 1342.862 | 1343.463 |
| 99.17255485310525 | 16.954 | 27.173 | 1342.792 | 1343.404 |
| 99.33060617329863 | 16.977 | 27.267 | 1342.639 | 1343.251 |
| 99.49795462997399 | 17.154 | 27.267 | 1342.497 | 1343.11 |
| 99.66530308664933 | 16.895 | 26.844 | 1342.038 | 1342.639 |
| 99.83265154332467 | 16.377 | 26.62 | 1342.003 | 1342.592 |
| 100.0 | 16.271 | 26.773 | 1342.003 | 1342.58 |